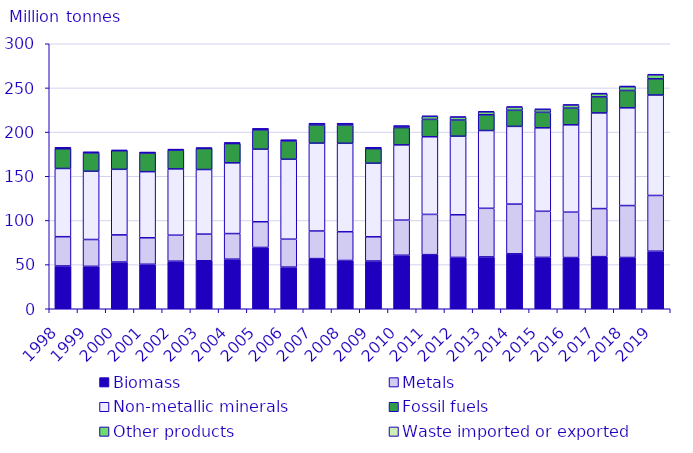
| Category | Biomass | Metals  | Non-metallic minerals | Fossil fuels | Other products | Waste imported or exported |
|---|---|---|---|---|---|---|
| 1998.0 | 48.45 | 33.124 | 77.234 | 22.307 | 1.083 | 0 |
| 1999.0 | 48.012 | 30.373 | 77.263 | 20.74 | 0.784 | 0 |
| 2000.0 | 52.89 | 30.749 | 74.22 | 21.066 | 0.882 | 0 |
| 2001.0 | 50.374 | 29.982 | 74.843 | 21.147 | 0.553 | 0 |
| 2002.0 | 53.847 | 29.421 | 75.081 | 21.298 | 0.531 | 0.002 |
| 2003.0 | 54.338 | 30.173 | 73.097 | 23.796 | 0.472 | 0.002 |
| 2004.0 | 56.123 | 28.995 | 80.051 | 21.838 | 0.702 | 0.002 |
| 2005.0 | 69.39 | 29.115 | 82.129 | 21.876 | 1.108 | 0.017 |
| 2006.0 | 47.128 | 31.629 | 90.495 | 20.558 | 1.006 | 0.008 |
| 2007.0 | 56.754 | 31.276 | 99.466 | 20.378 | 1.629 | 0.013 |
| 2008.0 | 54.647 | 32.553 | 100.126 | 20.614 | 1.537 | 0.027 |
| 2009.0 | 54.056 | 27.403 | 83.328 | 16.476 | 1.024 | 0.156 |
| 2010.0 | 60.555 | 39.747 | 85.219 | 19.63 | 1.573 | 0.29 |
| 2011.0 | 61.242 | 45.578 | 87.908 | 19.643 | 3.384 | 0.46 |
| 2012.0 | 58.132 | 48.252 | 88.97 | 18.269 | 3.263 | 0.534 |
| 2013.0 | 58.707 | 55.01 | 88.057 | 17.798 | 3.334 | 0.56 |
| 2014.0 | 62.179 | 56.273 | 88.018 | 18.189 | 3.507 | 0.667 |
| 2015.0 | 58.158 | 52.17 | 94.499 | 17.548 | 3.187 | 0.671 |
| 2016.0 | 57.97 | 51.378 | 98.879 | 18.861 | 3.379 | 0.712 |
| 2017.0 | 58.993 | 54.402 | 108.309 | 18.144 | 3.511 | 0.756 |
| 2018.0 | 58.033 | 58.791 | 110.646 | 19.639 | 4.279 | 0.736 |
| 2019.0 | 65.158 | 63.088 | 113.728 | 18.422 | 4.357 | 0.773 |